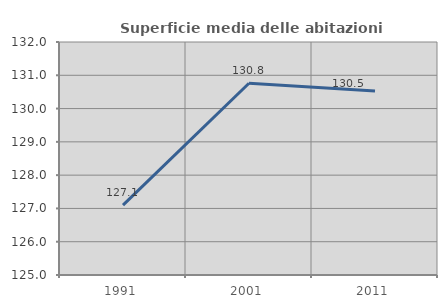
| Category | Superficie media delle abitazioni occupate |
|---|---|
| 1991.0 | 127.101 |
| 2001.0 | 130.76 |
| 2011.0 | 130.527 |